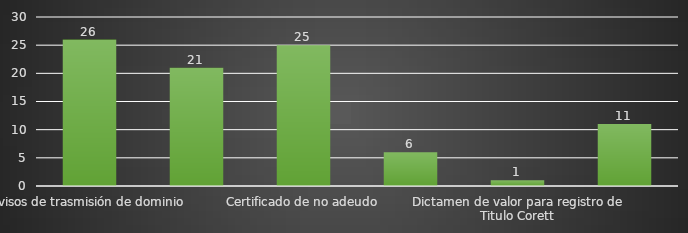
| Category | INDICADOR  |
|---|---|
| Avisos de trasmisión de dominio | 26 |
| Autorización de avalúos | 21 |
| Certificado de no adeudo | 25 |
| Historial catastral | 6 |
| Dictamen de valor para registro de Titulo Corett | 1 |
| Dictamen de valor para trasmisión de dominio | 11 |